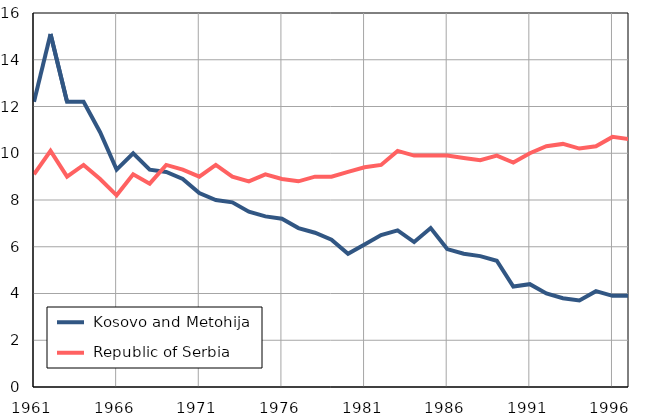
| Category |  Kosovo and Metohija |  Republic of Serbia |
|---|---|---|
| 1961.0 | 12.2 | 9.1 |
| 1962.0 | 15.1 | 10.1 |
| 1963.0 | 12.2 | 9 |
| 1964.0 | 12.2 | 9.5 |
| 1965.0 | 10.9 | 8.9 |
| 1966.0 | 9.3 | 8.2 |
| 1967.0 | 10 | 9.1 |
| 1968.0 | 9.3 | 8.7 |
| 1969.0 | 9.2 | 9.5 |
| 1970.0 | 8.9 | 9.3 |
| 1971.0 | 8.3 | 9 |
| 1972.0 | 8 | 9.5 |
| 1973.0 | 7.9 | 9 |
| 1974.0 | 7.5 | 8.8 |
| 1975.0 | 7.3 | 9.1 |
| 1976.0 | 7.2 | 8.9 |
| 1977.0 | 6.8 | 8.8 |
| 1978.0 | 6.6 | 9 |
| 1979.0 | 6.3 | 9 |
| 1980.0 | 5.7 | 9.2 |
| 1981.0 | 6.1 | 9.4 |
| 1982.0 | 6.5 | 9.5 |
| 1983.0 | 6.7 | 10.1 |
| 1984.0 | 6.2 | 9.9 |
| 1985.0 | 6.8 | 9.9 |
| 1986.0 | 5.9 | 9.9 |
| 1987.0 | 5.7 | 9.8 |
| 1988.0 | 5.6 | 9.7 |
| 1989.0 | 5.4 | 9.9 |
| 1990.0 | 4.3 | 9.6 |
| 1991.0 | 4.4 | 10 |
| 1992.0 | 4 | 10.3 |
| 1993.0 | 3.8 | 10.4 |
| 1994.0 | 3.7 | 10.2 |
| 1995.0 | 4.1 | 10.3 |
| 1996.0 | 3.9 | 10.7 |
| 1997.0 | 3.9 | 10.6 |